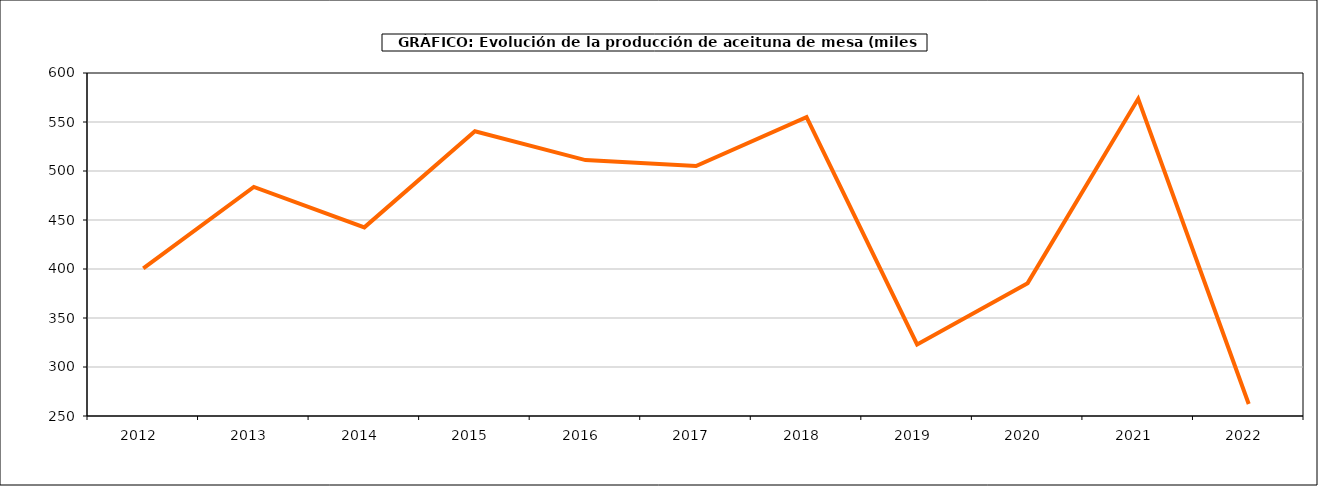
| Category | producción |
|---|---|
| 2012.0 | 400.651 |
| 2013.0 | 483.713 |
| 2014.0 | 442.478 |
| 2015.0 | 540.484 |
| 2016.0 | 511.122 |
| 2017.0 | 505.046 |
| 2018.0 | 555.033 |
| 2019.0 | 323.021 |
| 2020.0 | 385.57 |
| 2021.0 | 573.666 |
| 2022.0 | 262.276 |